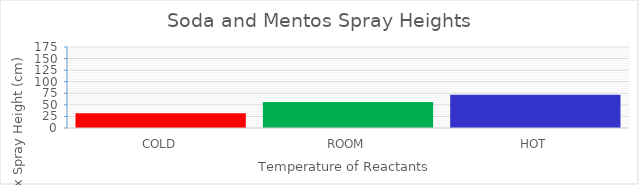
| Category | Avg. Max Spray (cm) |
|---|---|
| COLD | 32 |
| ROOM | 56 |
| HOT | 72 |